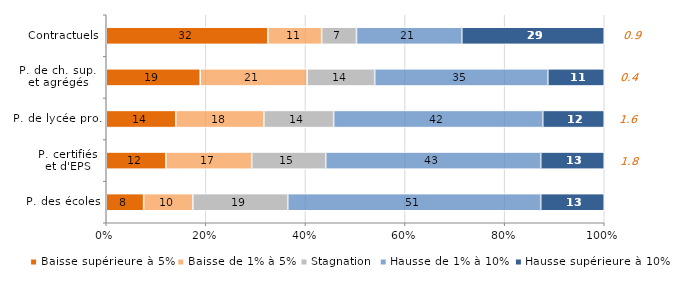
| Category | Baisse supérieure à 5% | Baisse de 1% à 5% | Stagnation | Hausse de 1% à 10% | Hausse supérieure à 10% |
|---|---|---|---|---|---|
| P. des écoles | 7.51 | 9.87 | 19.06 | 50.8 | 12.76 |
| P. certifiés
et d'EPS | 11.97 | 17.24 | 14.86 | 43.17 | 12.76 |
| P. de lycée pro. | 13.96 | 17.68 | 14.02 | 41.99 | 12.35 |
| P. de ch. sup. 
et agrégés | 18.87 | 21.46 | 13.57 | 34.77 | 11.33 |
| Contractuels | 32.46 | 10.79 | 7 | 21.14 | 28.61 |